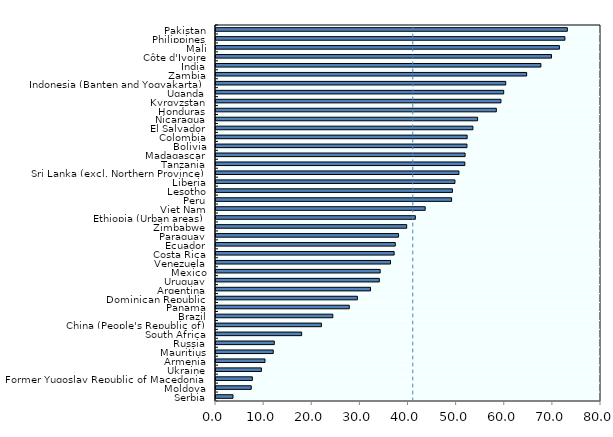
| Category | Persons employed in the informal sector as % of non-agricultural employment |
|---|---|
| Serbia | 3.529 |
| Moldova | 7.323 |
| Former Yugoslav Republic of Macedonia | 7.558 |
| Ukraine | 9.436 |
| Armenia | 10.177 |
| Mauritius | 11.894 |
| Russia | 12.111 |
| South Africa | 17.795 |
| China (People's Republic of) | 21.907 |
| Brazil | 24.278 |
| Panama | 27.695 |
| Dominican Republic | 29.378 |
| Argentina | 32.111 |
| Uruguay | 33.933 |
| Mexico | 34.114 |
| Venezuela | 36.264 |
| Costa Rica | 37.015 |
| Ecuador | 37.255 |
| Paraguay | 37.934 |
| Zimbabwe | 39.626 |
| Ethiopia (Urban areas) | 41.425 |
| Viet Nam | 43.47 |
| Peru | 48.955 |
| Lesotho | 49.127 |
| Liberia | 49.65 |
| Sri Lanka (excl. Northern Province) | 50.48 |
| Tanzania | 51.708 |
| Madagascar | 51.758 |
| Bolivia | 52.144 |
| Colombia | 52.186 |
| El Salvador | 53.383 |
| Nicaragua | 54.357 |
| Honduras | 58.251 |
| Kyrgyzstan | 59.207 |
| Uganda | 59.785 |
| Indonesia (Banten and Yogyakarta) | 60.205 |
| Zambia | 64.55 |
| India | 67.504 |
| Côte d'Ivoire | 69.721 |
| Mali | 71.358 |
| Philippines | 72.505 |
| Pakistan | 73.008 |